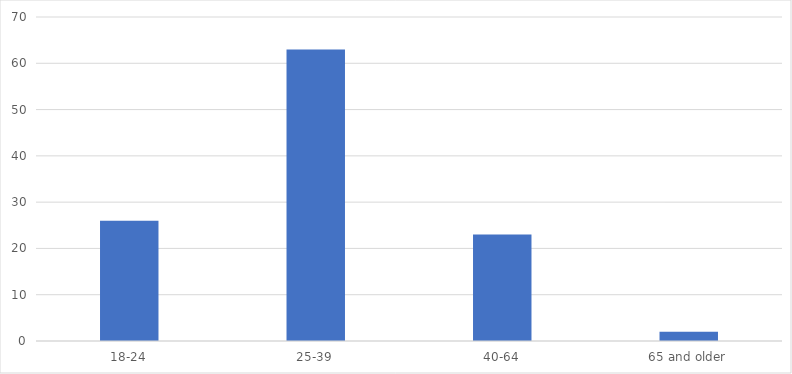
| Category | Number of Responses |
|---|---|
| 18-24 | 26 |
| 25-39 | 63 |
| 40-64 | 23 |
| 65 and older | 2 |